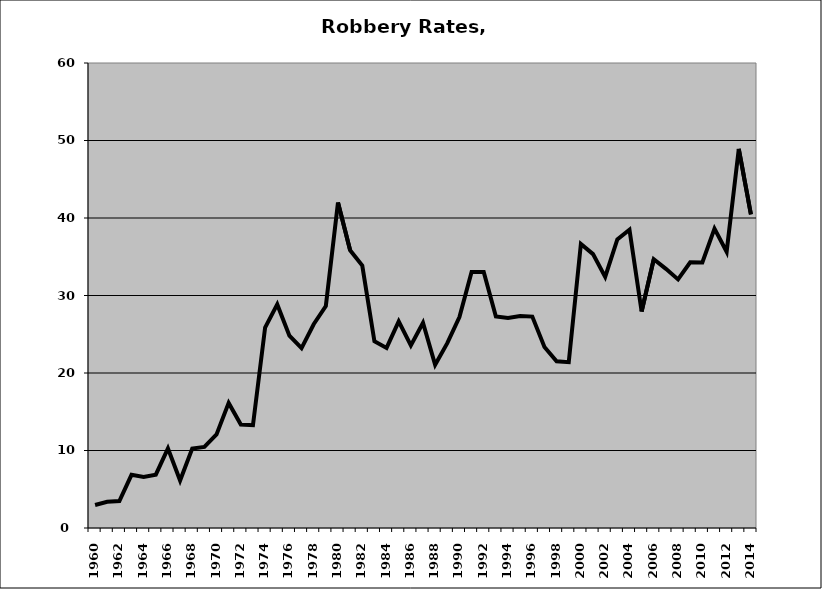
| Category | Robbery |
|---|---|
| 1960.0 | 2.966 |
| 1961.0 | 3.382 |
| 1962.0 | 3.481 |
| 1963.0 | 6.858 |
| 1964.0 | 6.575 |
| 1965.0 | 6.876 |
| 1966.0 | 10.279 |
| 1967.0 | 6.122 |
| 1968.0 | 10.256 |
| 1969.0 | 10.46 |
| 1970.0 | 12.065 |
| 1971.0 | 16.142 |
| 1972.0 | 13.359 |
| 1973.0 | 13.274 |
| 1974.0 | 25.866 |
| 1975.0 | 28.851 |
| 1976.0 | 24.818 |
| 1977.0 | 23.204 |
| 1978.0 | 26.292 |
| 1979.0 | 28.636 |
| 1980.0 | 41.997 |
| 1981.0 | 35.829 |
| 1982.0 | 33.859 |
| 1983.0 | 24.088 |
| 1984.0 | 23.234 |
| 1985.0 | 26.653 |
| 1986.0 | 23.564 |
| 1987.0 | 26.49 |
| 1988.0 | 21.057 |
| 1989.0 | 23.848 |
| 1990.0 | 27.226 |
| 1991.0 | 33.032 |
| 1992.0 | 33.033 |
| 1993.0 | 27.289 |
| 1994.0 | 27.089 |
| 1995.0 | 27.352 |
| 1996.0 | 27.281 |
| 1997.0 | 23.359 |
| 1998.0 | 21.519 |
| 1999.0 | 21.396 |
| 2000.0 | 36.657 |
| 2001.0 | 35.335 |
| 2002.0 | 32.407 |
| 2003.0 | 37.247 |
| 2004.0 | 38.486 |
| 2005.0 | 27.93 |
| 2006.0 | 34.68 |
| 2007.0 | 33.439 |
| 2008.0 | 32.076 |
| 2009.0 | 34.275 |
| 2010.0 | 34.258 |
| 2011.0 | 38.625 |
| 2012.0 | 35.638 |
| 2013.0 | 48.918 |
| 2014.0 | 40.473 |